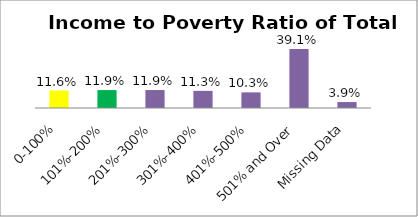
| Category | Percent |
|---|---|
| 0-100% | 0.116 |
| 101%-200% | 0.119 |
| 201%-300% | 0.119 |
| 301%-400% | 0.113 |
| 401%-500% | 0.103 |
| 501% and Over | 0.391 |
| Missing Data | 0.039 |